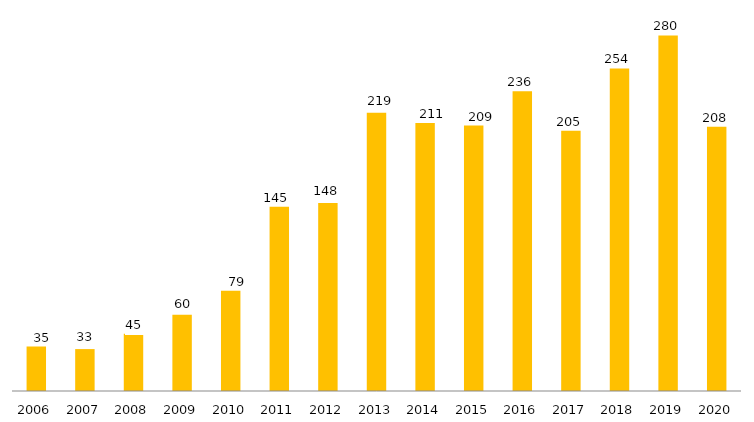
| Category | Programa |
|---|---|
| 2006.0 | 35 |
| 2007.0 | 33 |
| 2008.0 | 45 |
| 2009.0 | 60 |
| 2010.0 | 79 |
| 2011.0 | 145 |
| 2012.0 | 148 |
| 2013.0 | 219 |
| 2014.0 | 211 |
| 2015.0 | 209 |
| 2016.0 | 236 |
| 2017.0 | 205 |
| 2018.0 | 254 |
| 2019.0 | 280 |
| 2020.0 | 208 |